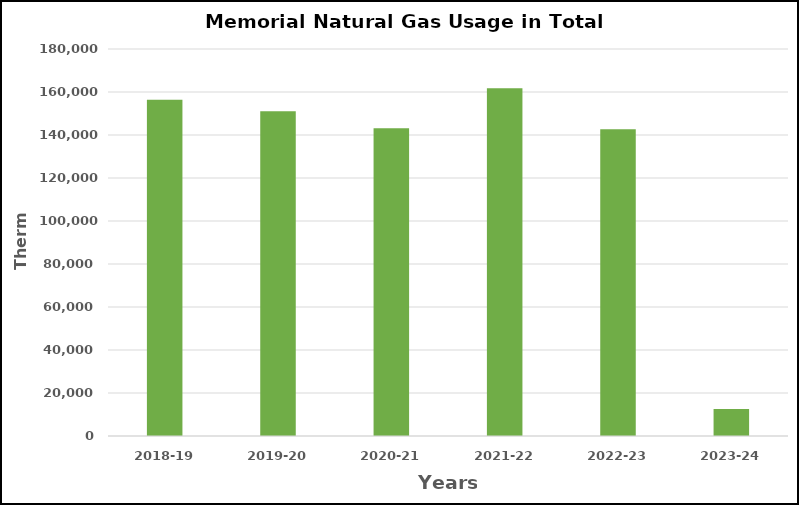
| Category | Series 0 |
|---|---|
| 2018-19 | 156436 |
| 2019-20 | 151072 |
| 2020-21 | 143123 |
| 2021-22 | 161719 |
| 2022-23 | 142715 |
| 2023-24 | 12520 |